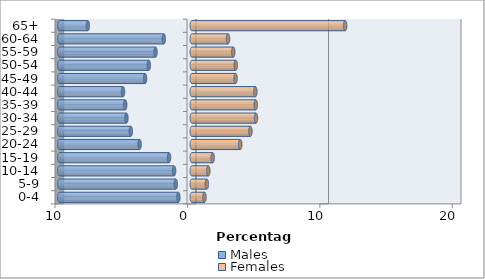
| Category | Males | Females |
|---|---|---|
| 0-4 | -1.012 | 0.958 |
| 5-9 | -1.206 | 1.138 |
| 10-14 | -1.337 | 1.252 |
| 15-19 | -1.716 | 1.578 |
| 20-24 | -3.939 | 3.659 |
| 25-29 | -4.604 | 4.429 |
| 30-34 | -4.936 | 4.847 |
| 35-39 | -5.026 | 4.832 |
| 40-44 | -5.19 | 4.801 |
| 45-49 | -3.526 | 3.304 |
| 50-54 | -3.243 | 3.319 |
| 55-59 | -2.738 | 3.133 |
| 60-64 | -2.113 | 2.737 |
| 65+ | -7.847 | 11.581 |